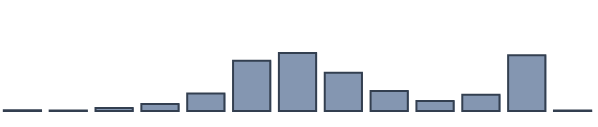
| Category | Series 0 |
|---|---|
| 0 | 0.233 |
| 1 | 0.146 |
| 2 | 1.056 |
| 3 | 2.566 |
| 4 | 6.285 |
| 5 | 18.068 |
| 6 | 20.922 |
| 7 | 13.762 |
| 8 | 7.184 |
| 9 | 3.607 |
| 10 | 5.897 |
| 11 | 20.106 |
| 12 | 0.169 |